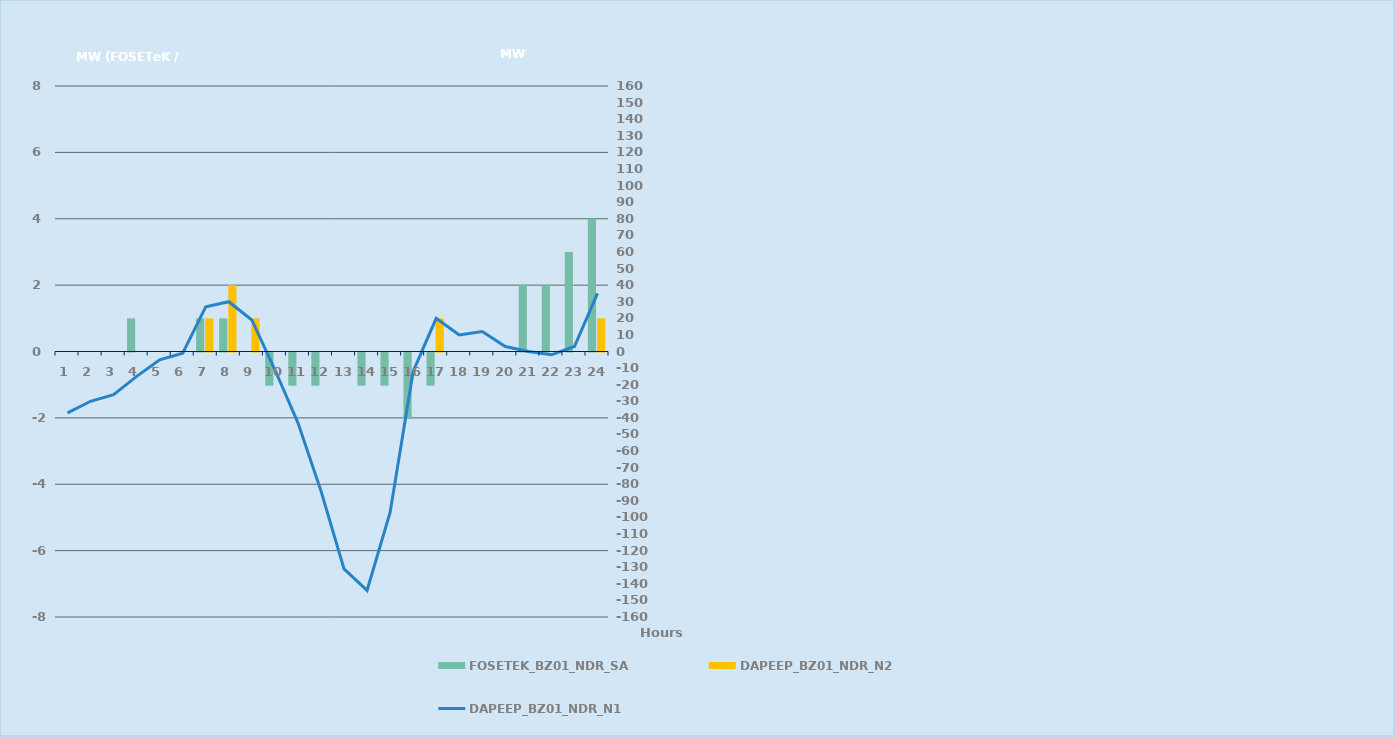
| Category | FOSETEK_BZ01_NDR_SA | DAPEEP_BZ01_NDR_N2 |
|---|---|---|
| 0 | 0 | 0 |
| 1 | 0 | 0 |
| 2 | 0 | 0 |
| 3 | 1 | 0 |
| 4 | 0 | 0 |
| 5 | 0 | 0 |
| 6 | 1 | 1 |
| 7 | 1 | 2 |
| 8 | 0 | 1 |
| 9 | -1 | 0 |
| 10 | -1 | 0 |
| 11 | -1 | 0 |
| 12 | 0 | 0 |
| 13 | -1 | 0 |
| 14 | -1 | 0 |
| 15 | -2 | 0 |
| 16 | -1 | 1 |
| 17 | 0 | 0 |
| 18 | 0 | 0 |
| 19 | 0 | 0 |
| 20 | 2 | 0 |
| 21 | 2 | 0 |
| 22 | 3 | 0 |
| 23 | 4 | 1 |